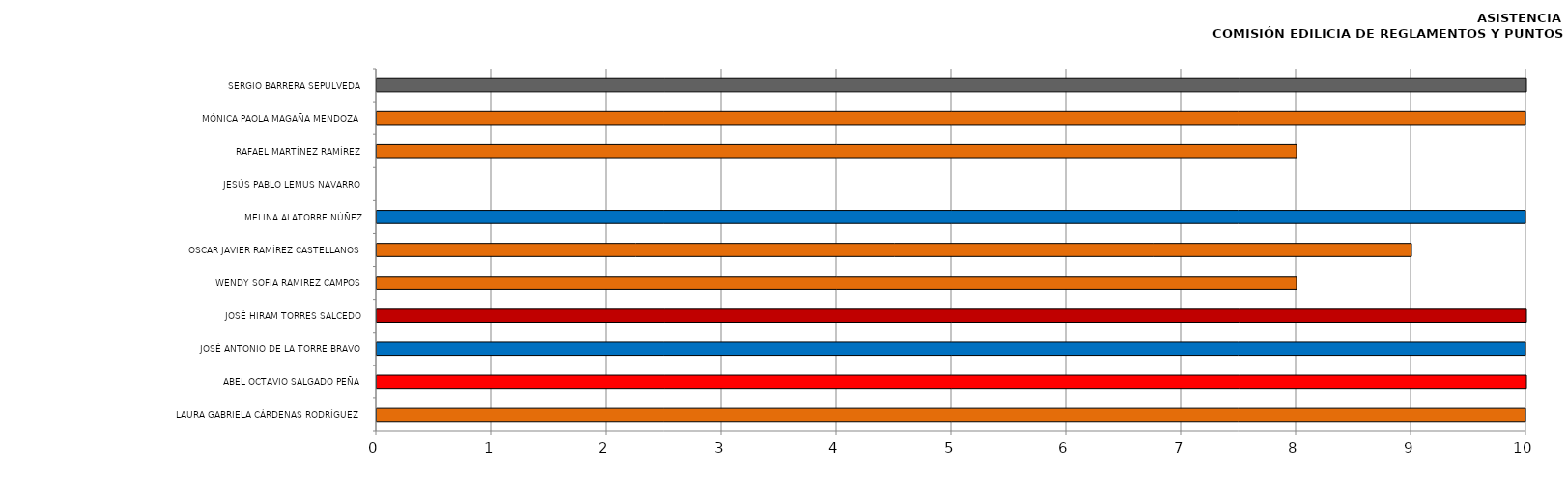
| Category | Series 0 |
|---|---|
| LAURA GABRIELA CÁRDENAS RODRÍGUEZ | 11 |
| ABEL OCTAVIO SALGADO PEÑA | 10 |
| JOSÉ ANTONIO DE LA TORRE BRAVO | 11 |
| JOSÉ HIRAM TORRES SALCEDO | 10 |
| WENDY SOFÍA RAMÍREZ CAMPOS | 8 |
| OSCAR JAVIER RAMÍREZ CASTELLANOS | 9 |
| MELINA ALATORRE NÚÑEZ | 11 |
| JESÚS PABLO LEMUS NAVARRO | 0 |
| RAFAEL MARTÍNEZ RAMÍREZ | 8 |
| MÓNICA PAOLA MAGAÑA MENDOZA | 11 |
| SERGIO BARRERA SEPULVEDA | 10 |